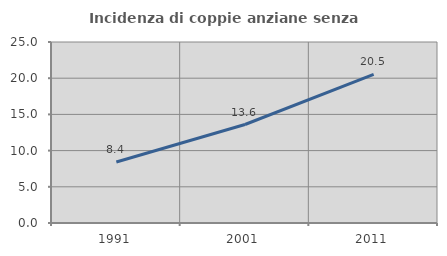
| Category | Incidenza di coppie anziane senza figli  |
|---|---|
| 1991.0 | 8.426 |
| 2001.0 | 13.602 |
| 2011.0 | 20.525 |